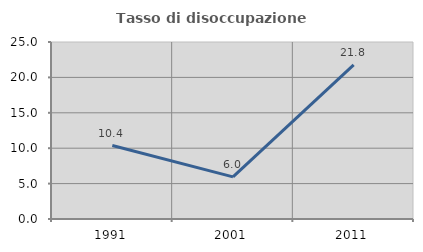
| Category | Tasso di disoccupazione giovanile  |
|---|---|
| 1991.0 | 10.375 |
| 2001.0 | 5.952 |
| 2011.0 | 21.774 |